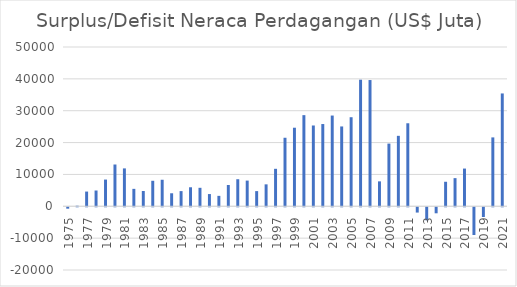
| Category | Surplus/Defisit Neraca Perdagangan (US$ Juta) |
|---|---|
| 1975.0 | -436.9 |
| 1976.0 | 180.4 |
| 1977.0 | 4622.3 |
| 1978.0 | 4952.8 |
| 1979.0 | 8387.8 |
| 1980.0 | 13116 |
| 1981.0 | 11892.4 |
| 1982.0 | 5469.4 |
| 1983.0 | 4794.1 |
| 1984.0 | 8005.7 |
| 1985.0 | 8327.6 |
| 1986.0 | 4086.6 |
| 1987.0 | 4765.3 |
| 1988.0 | 5970 |
| 1989.0 | 5799.3 |
| 1990.0 | 3838.3 |
| 1991.0 | 3273.6 |
| 1992.0 | 6687.4 |
| 1993.0 | 8495.2 |
| 1994.0 | 8064.7 |
| 1995.0 | 4764.1 |
| 1996.0 | 6886.1 |
| 1997.0 | 11763.8 |
| 1998.0 | 21510.7 |
| 1999.0 | 24662.2 |
| 2000.0 | 28609 |
| 2001.0 | 25361.2 |
| 2002.0 | 25816.8 |
| 2003.0 | 28483.5 |
| 2004.0 | 25059.6 |
| 2005.0 | 27958.9 |
| 2006.0 | 39732.6 |
| 2007.0 | 39628 |
| 2008.0 | 7823.4 |
| 2009.0 | 19681 |
| 2010.0 | 22116 |
| 2011.0 | 26060.6 |
| 2012.0 | -1658.2 |
| 2013.0 | -4077.1 |
| 2014.0 | -1886.4 |
| 2015.0 | 7698.3 |
| 2016.0 | 8836.7 |
| 2017.0 | 11842.2 |
| 2018.0 | -8698.3 |
| 2019.0 | -3044.7 |
| 2020.0 | 21623.2 |
| 2021.0 | 35419.5 |